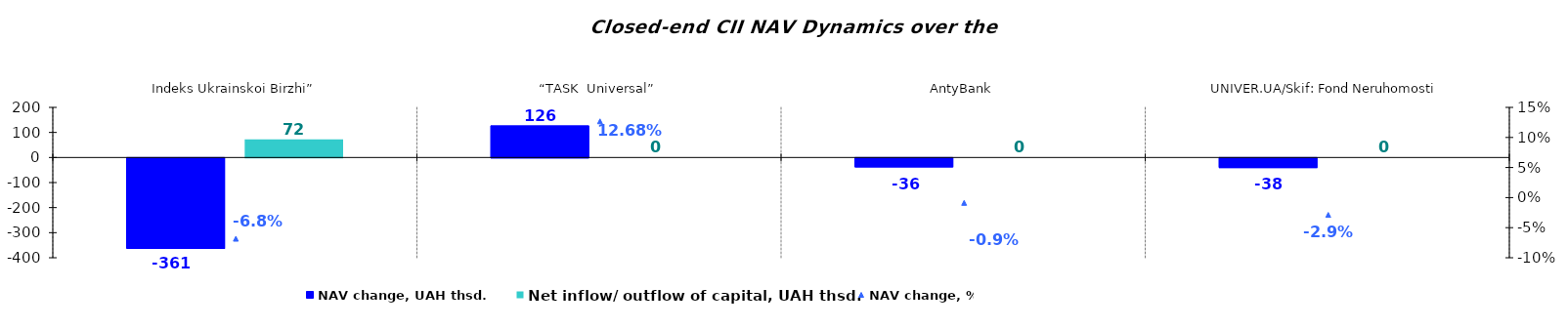
| Category | NAV change, UAH thsd. | Net inflow/ outflow of capital, UAH thsd. |
|---|---|---|
| Indeks Ukrainskoi Birzhi” | -360.627 | 72.085 |
| “TASK  Universal” | 126.486 | 0 |
| AntyBank | -35.703 | 0 |
| UNIVER.UA/Skif: Fond Neruhomosti | -38.227 | 0 |